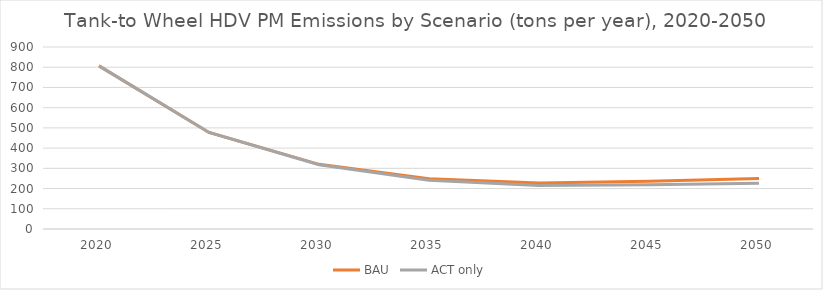
| Category | BAU | ACT only |
|---|---|---|
| 2020.0 | 806.776 | 806.776 |
| 2025.0 | 477.311 | 477.311 |
| 2030.0 | 319.724 | 317.637 |
| 2035.0 | 248.56 | 240.851 |
| 2040.0 | 227.005 | 215.059 |
| 2045.0 | 236.608 | 218.38 |
| 2050.0 | 250.08 | 225.868 |